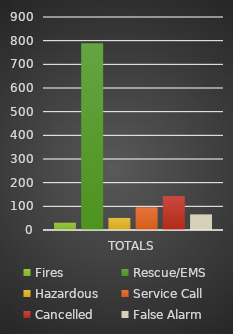
| Category | Fires | Rescue/EMS | Hazardous | Service Call | Cancelled  | False Alarm |
|---|---|---|---|---|---|---|
| TOTALS | 31 | 789 | 51 | 96 | 144 | 66 |